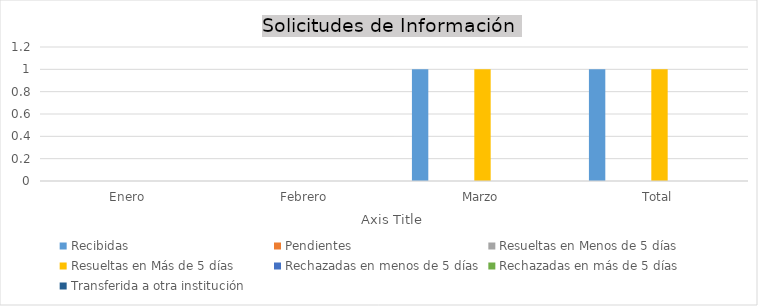
| Category | Recibidas  | Pendientes  | Resueltas en Menos de 5 días | Resueltas en Más de 5 días | Rechazadas en menos de 5 días | Rechazadas en más de 5 días | Transferida a otra institución |
|---|---|---|---|---|---|---|---|
| Enero | 0 | 0 | 0 | 0 | 0 | 0 | 0 |
| Febrero | 0 | 0 | 0 | 0 | 0 | 0 | 0 |
| Marzo | 1 | 0 | 0 | 1 | 0 | 0 | 0 |
| Total | 1 | 0 | 0 | 1 | 0 | 0 | 0 |